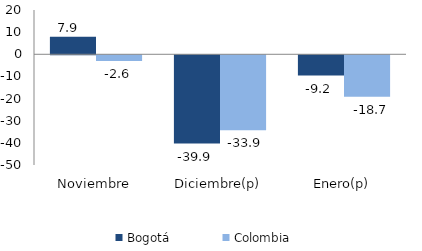
| Category | Bogotá | Colombia |
|---|---|---|
| Noviembre | 7.871 | -2.627 |
| Diciembre(p) | -39.872 | -33.856 |
| Enero(p) | -9.166 | -18.696 |